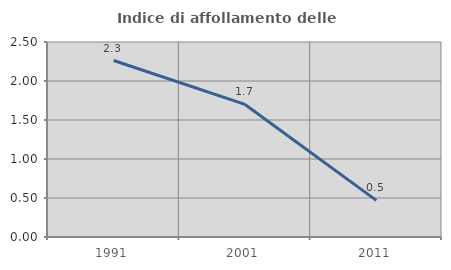
| Category | Indice di affollamento delle abitazioni  |
|---|---|
| 1991.0 | 2.262 |
| 2001.0 | 1.699 |
| 2011.0 | 0.469 |